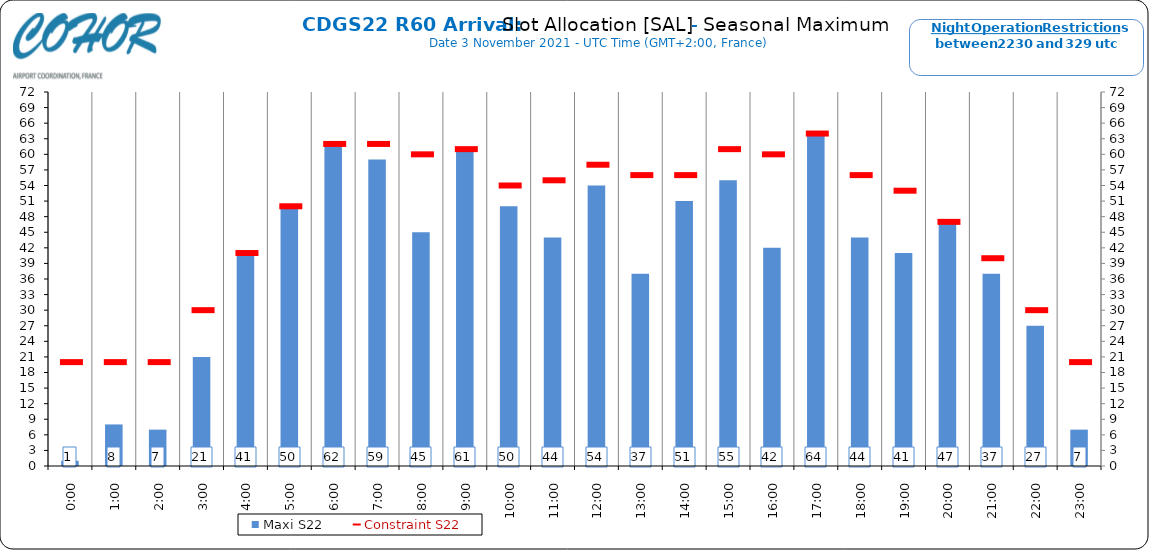
| Category | Maxi S22 |
|---|---|
| 0:00 | 1 |
| 1:00 | 8 |
| 2:00 | 7 |
| 3:00 | 21 |
| 4:00 | 41 |
| 5:00 | 50 |
| 6:00 | 62 |
| 7:00 | 59 |
| 8:00 | 45 |
| 9:00 | 61 |
| 10:00 | 50 |
| 11:00 | 44 |
| 12:00 | 54 |
| 13:00 | 37 |
| 14:00 | 51 |
| 15:00 | 55 |
| 16:00 | 42 |
| 17:00 | 64 |
| 18:00 | 44 |
| 19:00 | 41 |
| 20:00 | 47 |
| 21:00 | 37 |
| 22:00 | 27 |
| 23:00 | 7 |